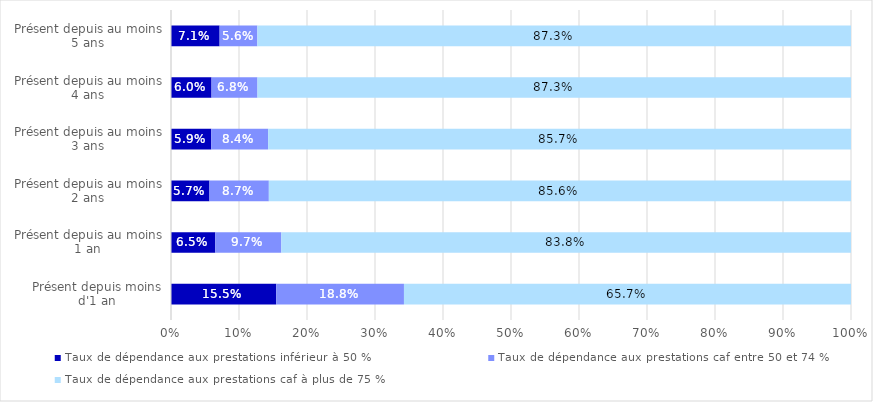
| Category |  Taux de dépendance aux prestations inférieur à 50 %  |  Taux de dépendance aux prestations caf entre 50 et 74 %  |  Taux de dépendance aux prestations caf à plus de 75 %  |
|---|---|---|---|
| Présent depuis moins d'1 an | 0.155 | 0.188 | 0.657 |
| Présent depuis au moins 1 an | 0.065 | 0.097 | 0.838 |
| Présent depuis au moins 2 ans | 0.057 | 0.087 | 0.856 |
| Présent depuis au moins 3 ans | 0.059 | 0.084 | 0.857 |
| Présent depuis au moins 4 ans | 0.06 | 0.068 | 0.873 |
| Présent depuis au moins 5 ans | 0.071 | 0.056 | 0.873 |